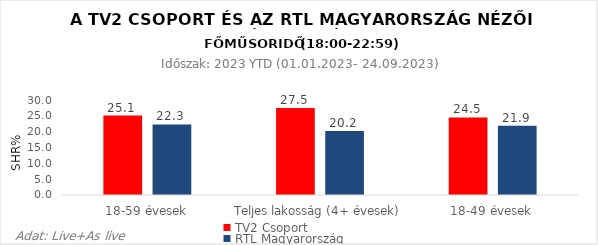
| Category | TV2 Csoport | RTL Magyarország |
|---|---|---|
| 18-59 évesek | 25.1 | 22.3 |
| Teljes lakosság (4+ évesek) | 27.5 | 20.2 |
| 18-49 évesek | 24.5 | 21.9 |